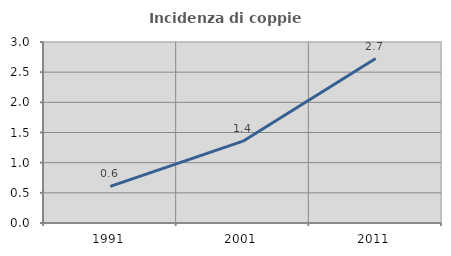
| Category | Incidenza di coppie miste |
|---|---|
| 1991.0 | 0.607 |
| 2001.0 | 1.356 |
| 2011.0 | 2.726 |